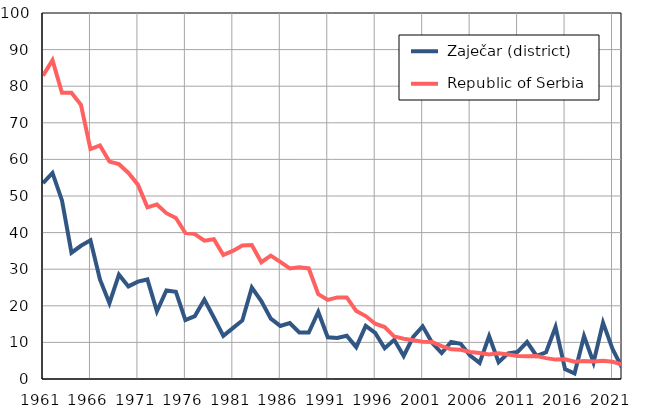
| Category |  Zaječar (district) |  Republic of Serbia |
|---|---|---|
| 1961.0 | 53.5 | 82.9 |
| 1962.0 | 56.3 | 87.1 |
| 1963.0 | 48.8 | 78.2 |
| 1964.0 | 34.5 | 78.2 |
| 1965.0 | 36.4 | 74.9 |
| 1966.0 | 37.9 | 62.8 |
| 1967.0 | 27.2 | 63.8 |
| 1968.0 | 20.7 | 59.4 |
| 1969.0 | 28.5 | 58.7 |
| 1970.0 | 25.3 | 56.3 |
| 1971.0 | 26.6 | 53.1 |
| 1972.0 | 27.2 | 46.9 |
| 1973.0 | 18.5 | 47.7 |
| 1974.0 | 24.2 | 45.3 |
| 1975.0 | 23.8 | 44 |
| 1976.0 | 16.1 | 39.9 |
| 1977.0 | 17.2 | 39.6 |
| 1978.0 | 21.7 | 37.8 |
| 1979.0 | 16.8 | 38.2 |
| 1980.0 | 11.8 | 33.9 |
| 1981.0 | 13.9 | 35 |
| 1982.0 | 16 | 36.5 |
| 1983.0 | 25 | 36.6 |
| 1984.0 | 21.3 | 31.9 |
| 1985.0 | 16.5 | 33.7 |
| 1986.0 | 14.5 | 32 |
| 1987.0 | 15.3 | 30.2 |
| 1988.0 | 12.7 | 30.5 |
| 1989.0 | 12.7 | 30.2 |
| 1990.0 | 18.3 | 23.2 |
| 1991.0 | 11.4 | 21.6 |
| 1992.0 | 11.2 | 22.3 |
| 1993.0 | 11.8 | 22.3 |
| 1994.0 | 8.7 | 18.6 |
| 1995.0 | 14.5 | 17.2 |
| 1996.0 | 12.6 | 15.1 |
| 1997.0 | 8.4 | 14.2 |
| 1998.0 | 10.7 | 11.6 |
| 1999.0 | 6.3 | 11 |
| 2000.0 | 11.5 | 10.6 |
| 2001.0 | 14.4 | 10.2 |
| 2002.0 | 9.9 | 10.1 |
| 2003.0 | 7.1 | 9 |
| 2004.0 | 10.1 | 8.1 |
| 2005.0 | 9.6 | 8 |
| 2006.0 | 6.4 | 7.4 |
| 2007.0 | 4.4 | 7.1 |
| 2008.0 | 11.7 | 6.7 |
| 2009.0 | 4.6 | 7 |
| 2010.0 | 7 | 6.7 |
| 2011.0 | 7.4 | 6.3 |
| 2012.0 | 10.1 | 6.2 |
| 2013.0 | 6.3 | 6.3 |
| 2014.0 | 7.3 | 5.7 |
| 2015.0 | 14.2 | 5.3 |
| 2016.0 | 2.7 | 5.4 |
| 2017.0 | 1.5 | 4.7 |
| 2018.0 | 11.7 | 4.9 |
| 2019.0 | 4.5 | 4.8 |
| 2020.0 | 15.4 | 5 |
| 2021.0 | 8.2 | 4.7 |
| 2022.0 | 3.1 | 4 |